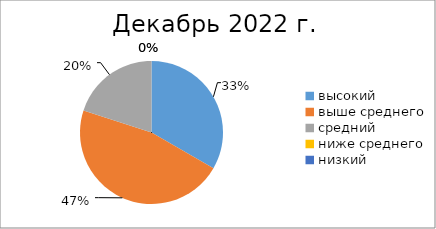
| Category | Series 0 |
|---|---|
| высокий | 5 |
| выше среднего | 7 |
| средний | 3 |
| ниже среднего | 0 |
| низкий | 0 |